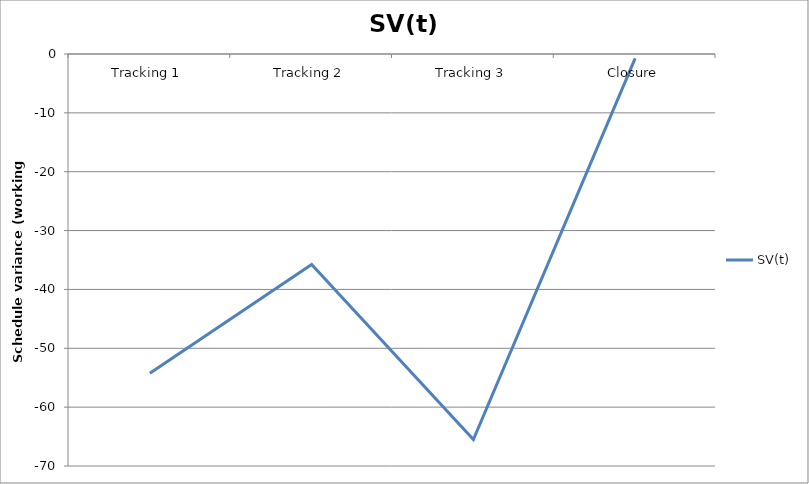
| Category | SV(t) |
|---|---|
| Tracking 1 | -54.25 |
| Tracking 2 | -35.75 |
| Tracking 3 | -65.5 |
| Closure | -0.75 |